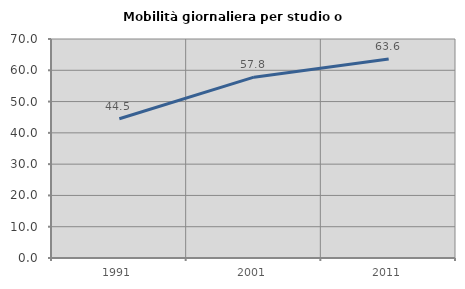
| Category | Mobilità giornaliera per studio o lavoro |
|---|---|
| 1991.0 | 44.491 |
| 2001.0 | 57.803 |
| 2011.0 | 63.62 |